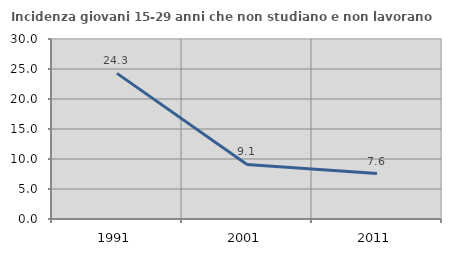
| Category | Incidenza giovani 15-29 anni che non studiano e non lavorano  |
|---|---|
| 1991.0 | 24.272 |
| 2001.0 | 9.091 |
| 2011.0 | 7.576 |